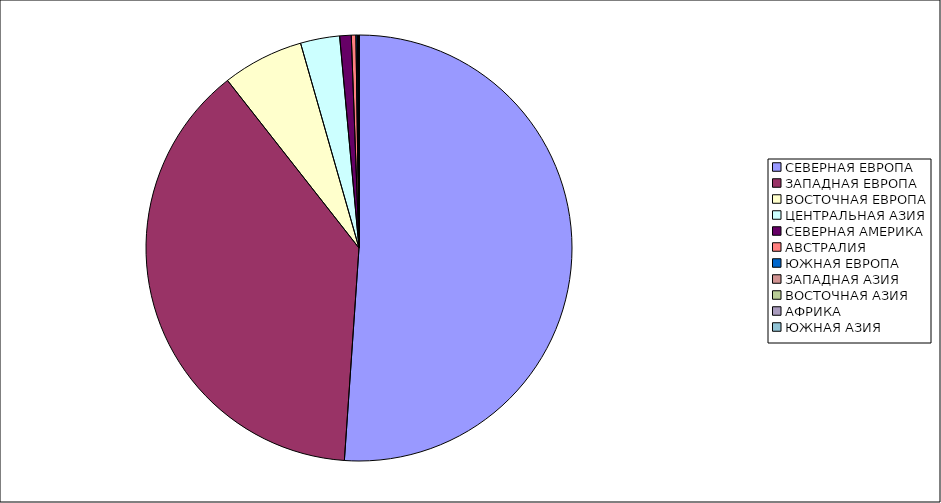
| Category | Оборот |
|---|---|
| СЕВЕРНАЯ ЕВРОПА | 51.094 |
| ЗАПАДНАЯ ЕВРОПА | 38.316 |
| ВОСТОЧНАЯ ЕВРОПА | 6.167 |
| ЦЕНТРАЛЬНАЯ АЗИЯ | 2.97 |
| СЕВЕРНАЯ АМЕРИКА | 0.875 |
| АВСТРАЛИЯ | 0.347 |
| ЮЖНАЯ ЕВРОПА | 0.113 |
| ЗАПАДНАЯ АЗИЯ | 0.095 |
| ВОСТОЧНАЯ АЗИЯ | 0.018 |
| АФРИКА | 0.003 |
| ЮЖНАЯ АЗИЯ | 0.003 |